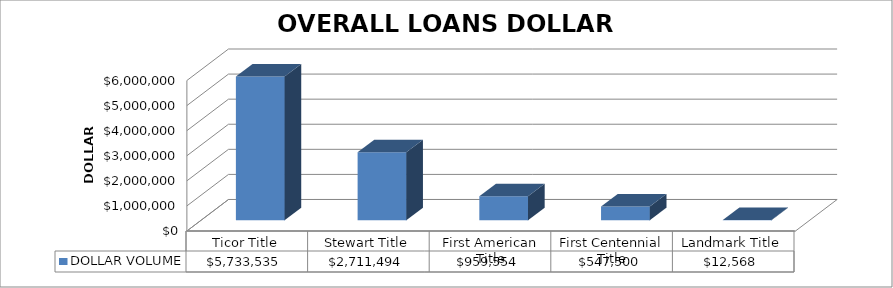
| Category | DOLLAR VOLUME |
|---|---|
| Ticor Title | 5733535 |
| Stewart Title | 2711494 |
| First American Title | 959554 |
| First Centennial Title | 547500 |
| Landmark Title | 12568 |